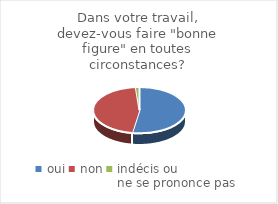
| Category | Dans votre travail, devez-vous faire "bonne figure" en toutes circonstances? |
|---|---|
| oui | 41 |
| non | 36 |
| indécis ou 
ne se prononce pas | 1 |